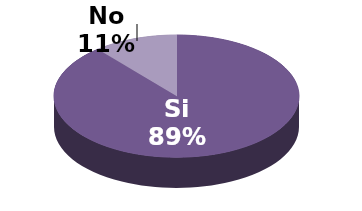
| Category | Series 1 |
|---|---|
| Si | 8 |
| No | 1 |